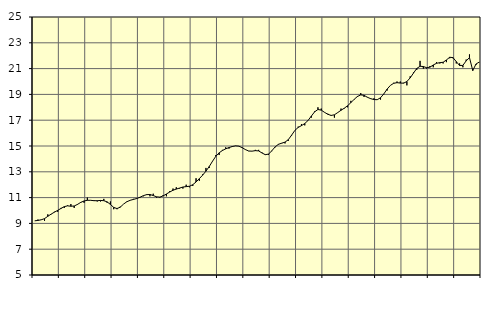
| Category | Piggar | Finansiell verksamhet, företagstjänster, SNI 64-82 |
|---|---|---|
| nan | 9.2 | 9.2 |
| 87.0 | 9.3 | 9.23 |
| 87.0 | 9.3 | 9.28 |
| 87.0 | 9.2 | 9.37 |
| nan | 9.7 | 9.55 |
| 88.0 | 9.7 | 9.72 |
| 88.0 | 9.9 | 9.87 |
| 88.0 | 9.9 | 10.01 |
| nan | 10.2 | 10.16 |
| 89.0 | 10.2 | 10.3 |
| 89.0 | 10.4 | 10.36 |
| 89.0 | 10.5 | 10.33 |
| nan | 10.2 | 10.35 |
| 90.0 | 10.5 | 10.47 |
| 90.0 | 10.6 | 10.63 |
| 90.0 | 10.6 | 10.74 |
| nan | 11 | 10.79 |
| 91.0 | 10.8 | 10.79 |
| 91.0 | 10.8 | 10.76 |
| 91.0 | 10.7 | 10.76 |
| nan | 10.7 | 10.78 |
| 92.0 | 10.9 | 10.76 |
| 92.0 | 10.6 | 10.67 |
| 92.0 | 10.7 | 10.47 |
| nan | 10.1 | 10.24 |
| 93.0 | 10.1 | 10.15 |
| 93.0 | 10.3 | 10.26 |
| 93.0 | 10.5 | 10.5 |
| nan | 10.7 | 10.68 |
| 94.0 | 10.8 | 10.79 |
| 94.0 | 10.9 | 10.86 |
| 94.0 | 10.9 | 10.93 |
| nan | 11 | 11.03 |
| 95.0 | 11.1 | 11.15 |
| 95.0 | 11.2 | 11.23 |
| 95.0 | 11.1 | 11.24 |
| nan | 11.3 | 11.16 |
| 96.0 | 11 | 11.06 |
| 96.0 | 11 | 11.04 |
| 96.0 | 11.2 | 11.13 |
| nan | 11.1 | 11.28 |
| 97.0 | 11.5 | 11.43 |
| 97.0 | 11.7 | 11.57 |
| 97.0 | 11.8 | 11.66 |
| nan | 11.7 | 11.74 |
| 98.0 | 11.7 | 11.82 |
| 98.0 | 12 | 11.85 |
| 98.0 | 11.8 | 11.88 |
| nan | 11.9 | 12 |
| 99.0 | 12.5 | 12.21 |
| 99.0 | 12.3 | 12.47 |
| 99.0 | 12.8 | 12.74 |
| nan | 13.3 | 13.05 |
| 0.0 | 13.3 | 13.41 |
| 0.0 | 13.8 | 13.82 |
| 0.0 | 14.3 | 14.2 |
| nan | 14.3 | 14.47 |
| 1.0 | 14.7 | 14.65 |
| 1.0 | 14.9 | 14.78 |
| 1.0 | 14.8 | 14.88 |
| nan | 15 | 14.96 |
| 2.0 | 15 | 15.01 |
| 2.0 | 15 | 14.99 |
| 2.0 | 14.9 | 14.87 |
| nan | 14.7 | 14.72 |
| 3.0 | 14.6 | 14.61 |
| 3.0 | 14.6 | 14.6 |
| 3.0 | 14.7 | 14.64 |
| nan | 14.7 | 14.62 |
| 4.0 | 14.5 | 14.46 |
| 4.0 | 14.3 | 14.33 |
| 4.0 | 14.3 | 14.37 |
| nan | 14.6 | 14.63 |
| 5.0 | 14.9 | 14.93 |
| 5.0 | 15.1 | 15.13 |
| 5.0 | 15.2 | 15.22 |
| nan | 15.2 | 15.3 |
| 6.0 | 15.4 | 15.49 |
| 6.0 | 15.8 | 15.84 |
| 6.0 | 16.2 | 16.21 |
| nan | 16.5 | 16.44 |
| 7.0 | 16.7 | 16.58 |
| 7.0 | 16.6 | 16.74 |
| 7.0 | 17 | 16.98 |
| nan | 17.2 | 17.32 |
| 8.0 | 17.7 | 17.65 |
| 8.0 | 18 | 17.83 |
| 8.0 | 17.9 | 17.78 |
| nan | 17.6 | 17.61 |
| 9.0 | 17.5 | 17.46 |
| 9.0 | 17.4 | 17.37 |
| 9.0 | 17.2 | 17.42 |
| nan | 17.6 | 17.59 |
| 10.0 | 17.9 | 17.77 |
| 10.0 | 17.9 | 17.93 |
| 10.0 | 18 | 18.12 |
| nan | 18.5 | 18.36 |
| 11.0 | 18.6 | 18.62 |
| 11.0 | 18.8 | 18.84 |
| 11.0 | 19.1 | 18.96 |
| nan | 18.8 | 18.93 |
| 12.0 | 18.8 | 18.78 |
| 12.0 | 18.7 | 18.67 |
| 12.0 | 18.7 | 18.6 |
| nan | 18.6 | 18.59 |
| 13.0 | 18.6 | 18.74 |
| 13.0 | 19 | 19.04 |
| 13.0 | 19.3 | 19.41 |
| nan | 19.7 | 19.7 |
| 14.0 | 19.9 | 19.86 |
| 14.0 | 20 | 19.91 |
| 14.0 | 20 | 19.88 |
| nan | 19.9 | 19.87 |
| 15.0 | 19.7 | 20 |
| 15.0 | 20.4 | 20.28 |
| 15.0 | 20.7 | 20.65 |
| nan | 20.9 | 21.01 |
| 16.0 | 21.6 | 21.18 |
| 16.0 | 21 | 21.16 |
| 16.0 | 21 | 21.07 |
| nan | 21.2 | 21.11 |
| 17.0 | 21.1 | 21.28 |
| 17.0 | 21.5 | 21.41 |
| 17.0 | 21.4 | 21.46 |
| nan | 21.4 | 21.49 |
| 18.0 | 21.5 | 21.67 |
| 18.0 | 21.8 | 21.88 |
| 18.0 | 21.8 | 21.85 |
| nan | 21.4 | 21.54 |
| 19.0 | 21.4 | 21.24 |
| 19.0 | 21.1 | 21.25 |
| 19.0 | 21.7 | 21.6 |
| nan | 22.1 | 21.85 |
| 20.0 | 20.9 | 20.85 |
| 20.0 | 21.3 | 21.36 |
| 20.0 | 21.5 | 21.51 |